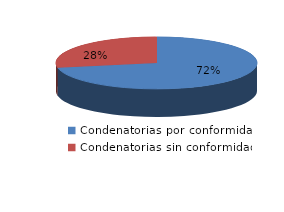
| Category | Series 0 |
|---|---|
| 0 | 436 |
| 1 | 170 |